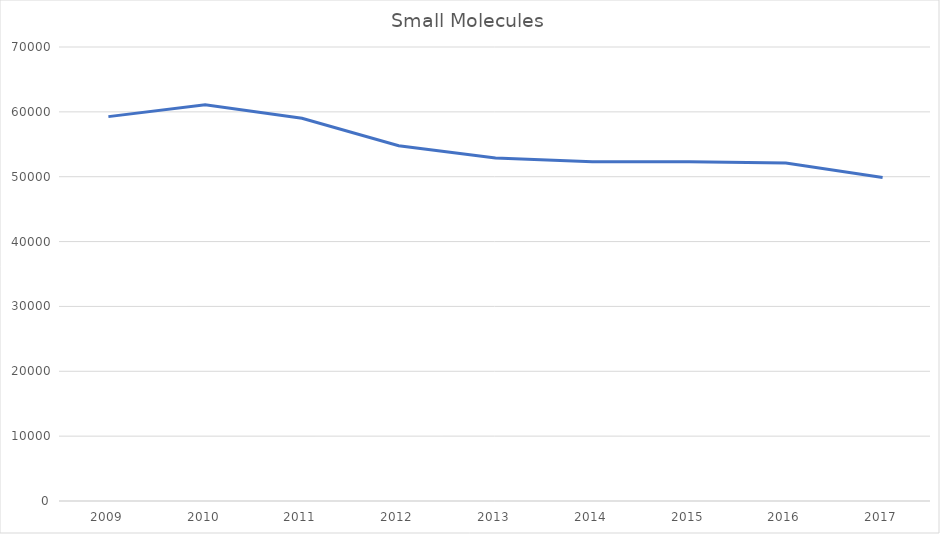
| Category | Small Molecules |
|---|---|
| 2009 | 59266 |
| 2010 | 61112 |
| 2011 | 59005 |
| 2012 | 54770 |
| 2013 | 52896 |
| 2014 | 52297 |
| 2015 | 52298 |
| 2016 | 52124 |
| 2017 | 49866 |